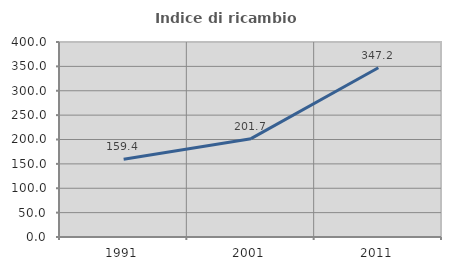
| Category | Indice di ricambio occupazionale  |
|---|---|
| 1991.0 | 159.445 |
| 2001.0 | 201.723 |
| 2011.0 | 347.202 |